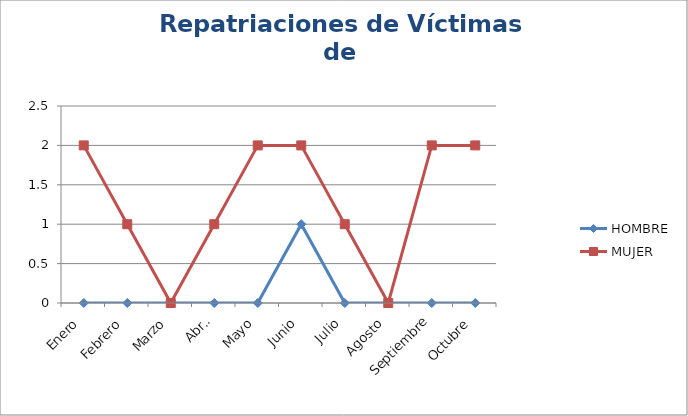
| Category | HOMBRE | MUJER |
|---|---|---|
| Enero | 0 | 2 |
| Febrero | 0 | 1 |
| Marzo | 0 | 0 |
| Abril | 0 | 1 |
| Mayo | 0 | 2 |
| Junio | 1 | 2 |
| Julio | 0 | 1 |
| Agosto | 0 | 0 |
| Septiembre | 0 | 2 |
| Octubre | 0 | 2 |